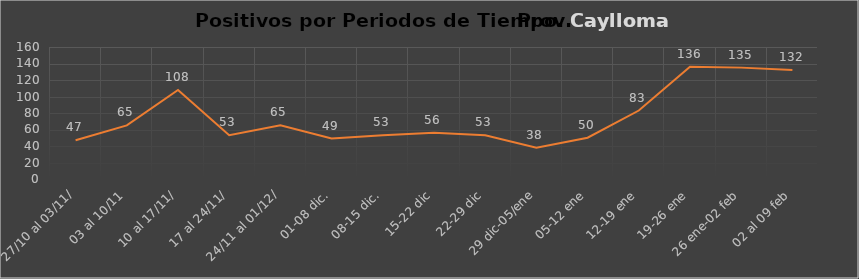
| Category | Prov. Caylloma  |
|---|---|
| 27/10 al 03/11/ | 47 |
| 03 al 10/11 | 65 |
| 10 al 17/11/ | 108 |
|  17 al 24/11/ | 53 |
|  24/11 al 01/12/ | 65 |
| 01-08 dic. | 49 |
| 08-15 dic. | 53 |
| 15-22 dic | 56 |
| 22-29 dic | 53 |
| 29 dic-05/ene | 38 |
| 05-12 ene | 50 |
| 12-19 ene | 83 |
| 19-26 ene | 136 |
| 26 ene-02 feb | 135 |
| 02 al 09 feb | 132 |